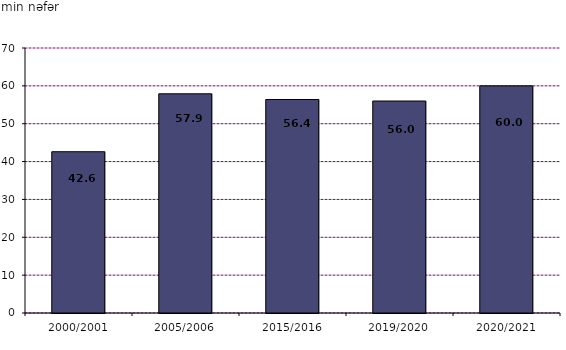
| Category | min nцfцr |
|---|---|
| 2000/2001 | 42.6 |
| 2005/2006 | 57.9 |
| 2015/2016 | 56.4 |
| 2019/2020 | 56 |
| 2020/2021 | 60 |